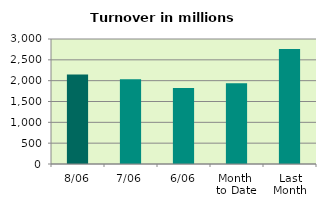
| Category | Series 0 |
|---|---|
| 8/06 | 2149.916 |
| 7/06 | 2036.129 |
| 6/06 | 1825.969 |
| Month 
to Date | 1940.395 |
| Last
Month | 2758.944 |